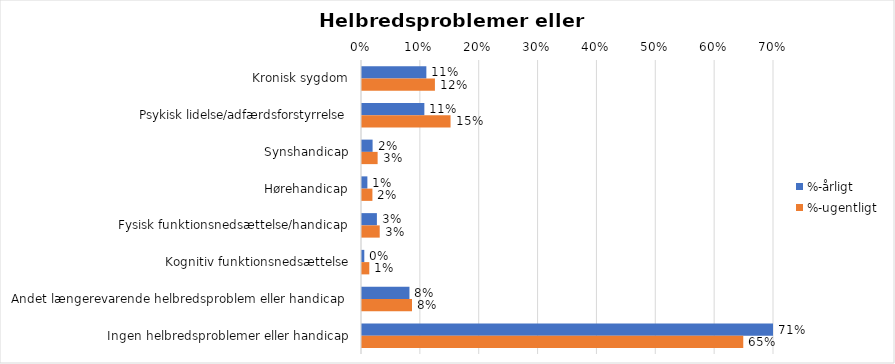
| Category | %-årligt | %-ugentligt |
|---|---|---|
| Kronisk sygdom | 0.109 | 0.124 |
| Psykisk lidelse/adfærdsforstyrrelse | 0.106 | 0.15 |
| Synshandicap | 0.018 | 0.027 |
| Hørehandicap | 0.009 | 0.018 |
| Fysisk funktionsnedsættelse/handicap | 0.025 | 0.03 |
| Kognitiv funktionsnedsættelse | 0.004 | 0.012 |
| Andet længerevarende helbredsproblem eller handicap  | 0.081 | 0.085 |
| Ingen helbredsproblemer eller handicap | 0.71 | 0.648 |